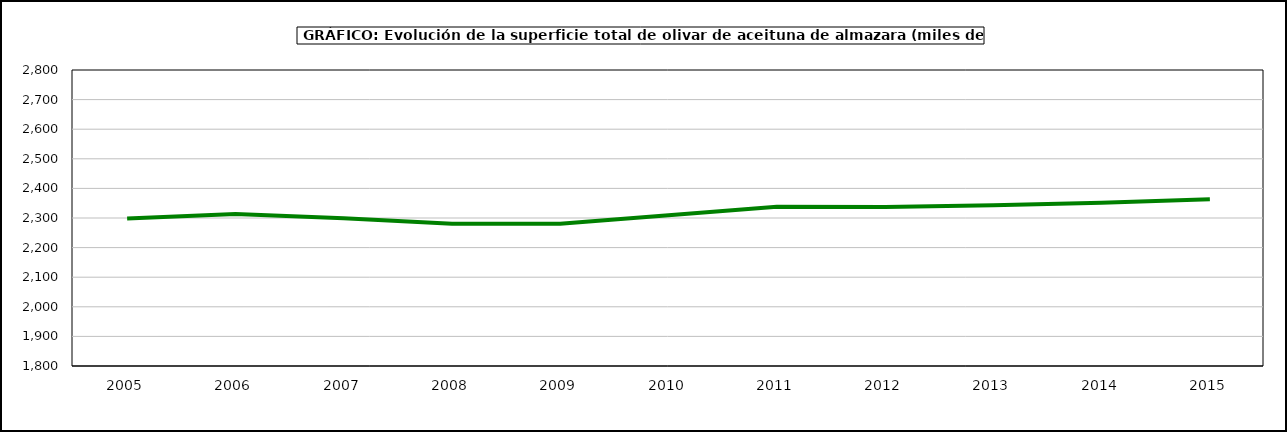
| Category | superficie |
|---|---|
| 2005.0 | 2298.45 |
| 2006.0 | 2313.869 |
| 2007.0 | 2299.322 |
| 2008.0 | 2280.579 |
| 2009.0 | 2280.456 |
| 2010.0 | 2309.46 |
| 2011.0 | 2337.913 |
| 2012.0 | 2337.582 |
| 2013.0 | 2343.184 |
| 2014.0 | 2351.428 |
| 2015.0 | 2363.082 |